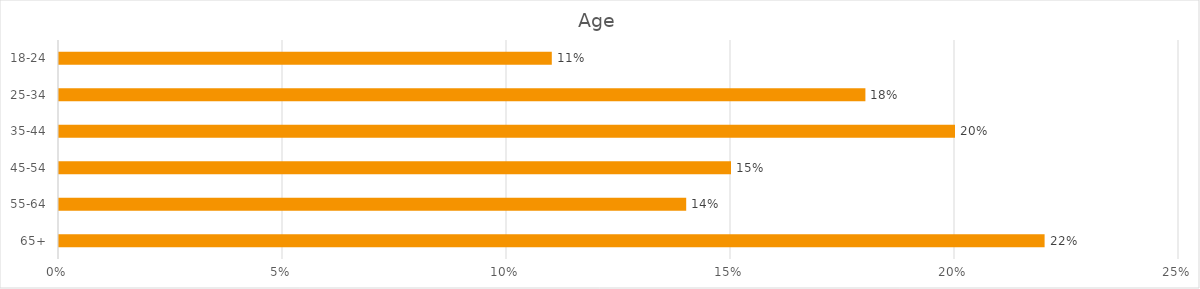
| Category | Age |
|---|---|
| 65+ | 0.22 |
| 55-64 | 0.14 |
| 45-54 | 0.15 |
| 35-44 | 0.2 |
| 25-34 | 0.18 |
| 18-24 | 0.11 |